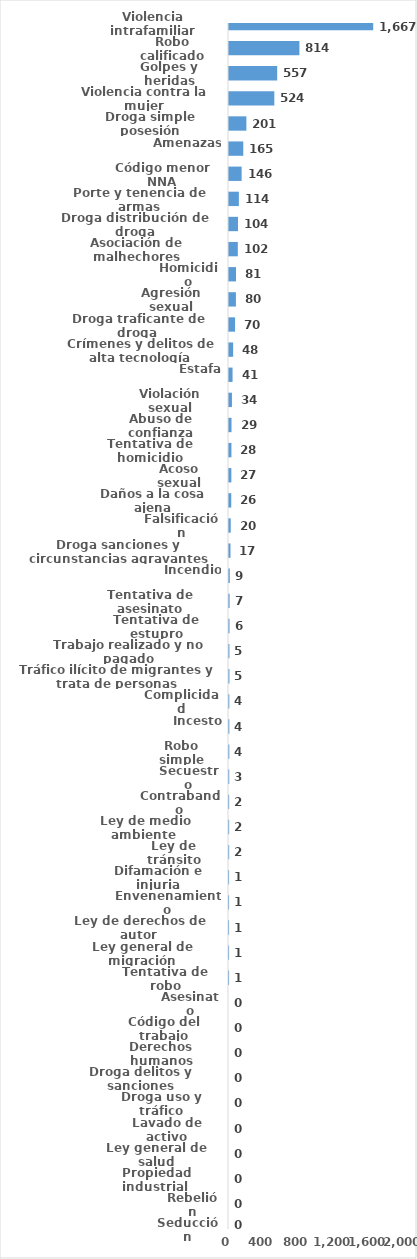
| Category | Series 0 |
|---|---|
| Violencia intrafamiliar | 1667 |
| Robo calificado | 814 |
| Golpes y heridas | 557 |
| Violencia contra la mujer | 524 |
| Droga simple posesión | 201 |
| Amenazas | 165 |
| Código menor NNA | 146 |
| Porte y tenencia de armas | 114 |
| Droga distribución de droga | 104 |
| Asociación de malhechores | 102 |
| Homicidio | 81 |
| Agresión sexual | 80 |
| Droga traficante de droga  | 70 |
| Crímenes y delitos de alta tecnología | 48 |
| Estafa | 41 |
| Violación sexual | 34 |
| Abuso de confianza | 29 |
| Tentativa de homicidio | 28 |
| Acoso sexual | 27 |
| Daños a la cosa ajena | 26 |
| Falsificación | 20 |
| Droga sanciones y circunstancias agravantes | 17 |
| Incendio | 9 |
| Tentativa de asesinato | 7 |
| Tentativa de estupro | 6 |
| Trabajo realizado y no pagado | 5 |
| Tráfico ilícito de migrantes y trata de personas | 5 |
| Complicidad | 4 |
| Incesto | 4 |
| Robo simple | 4 |
| Secuestro | 3 |
| Contrabando | 2 |
| Ley de medio ambiente  | 2 |
| Ley de tránsito | 2 |
| Difamación e injuria | 1 |
| Envenenamiento | 1 |
| Ley de derechos de autor  | 1 |
| Ley general de migración | 1 |
| Tentativa de robo | 1 |
| Asesinato | 0 |
| Código del trabajo | 0 |
| Derechos humanos | 0 |
| Droga delitos y sanciones | 0 |
| Droga uso y tráfico | 0 |
| Lavado de activo | 0 |
| Ley general de salud | 0 |
| Propiedad industrial  | 0 |
| Rebelión | 0 |
| Seducción | 0 |